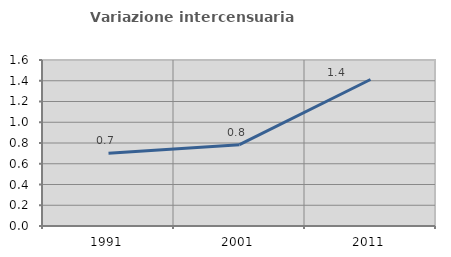
| Category | Variazione intercensuaria annua |
|---|---|
| 1991.0 | 0.702 |
| 2001.0 | 0.784 |
| 2011.0 | 1.412 |